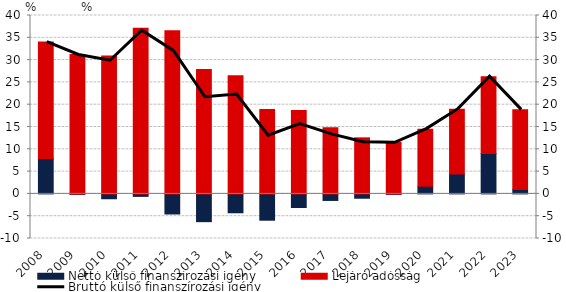
| Category | Nettó külső finanszírozási igény | Lejáró adósság |
|---|---|---|
| 2008.0 | 7.937 | 26.102 |
| 2009.0 | -0.115 | 31.264 |
| 2010.0 | -1.088 | 30.946 |
| 2011.0 | -0.558 | 37.14 |
| 2012.0 | -4.505 | 36.569 |
| 2013.0 | -6.224 | 27.885 |
| 2014.0 | -4.231 | 26.516 |
| 2015.0 | -5.901 | 18.943 |
| 2016.0 | -3.053 | 18.692 |
| 2017.0 | -1.469 | 14.806 |
| 2018.0 | -0.969 | 12.568 |
| 2019.0 | -0.113 | 11.555 |
| 2020.0 | 1.705 | 12.818 |
| 2021.0 | 4.485 | 14.514 |
| 2022.0 | 9.05 | 17.223 |
| 2023.0 | 0.978 | 17.862 |